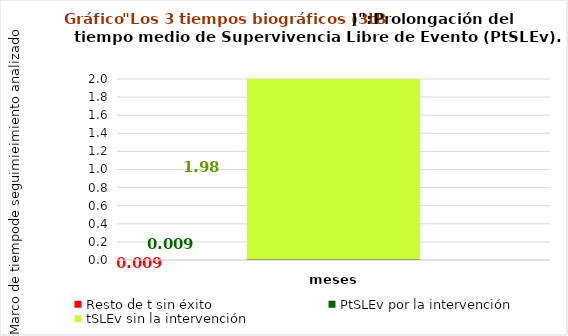
| Category | Resto de t sin éxito | PtSLEv por la intervención | tSLEv sin la intervención |
|---|---|---|---|
| meses | 0.009 | 0.009 | 1.982 |